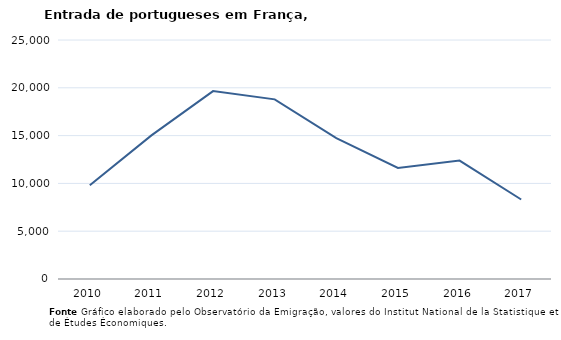
| Category | Entradas |
|---|---|
| 2010.0 | 9801 |
| 2011.0 | 15023 |
| 2012.0 | 19658 |
| 2013.0 | 18792 |
| 2014.0 | 14733 |
| 2015.0 | 11617 |
| 2016.0 | 12384 |
| 2017.0 | 8316 |